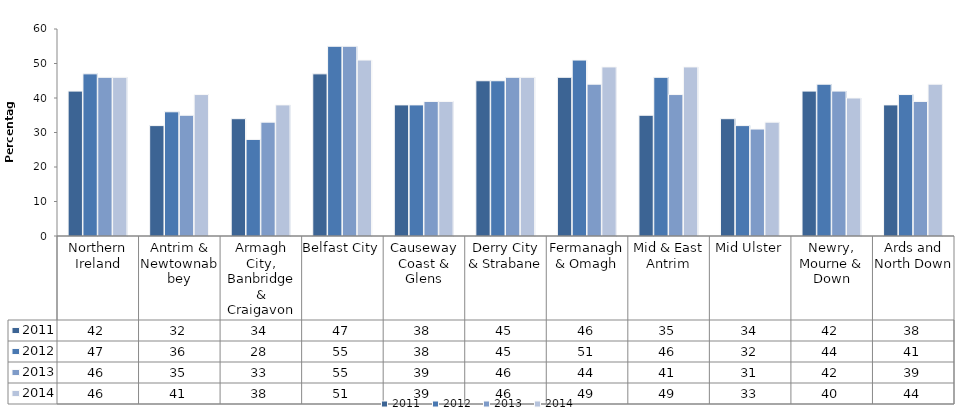
| Category | 2011 | 2012 | 2013 | 2014 |
|---|---|---|---|---|
| Northern Ireland | 42 | 47 | 46 | 46 |
| Antrim & Newtownabbey | 32 | 36 | 35 | 41 |
| Armagh City, Banbridge & Craigavon | 34 | 28 | 33 | 38 |
| Belfast City | 47 | 55 | 55 | 51 |
| Causeway Coast & Glens | 38 | 38 | 39 | 39 |
| Derry City & Strabane | 45 | 45 | 46 | 46 |
| Fermanagh & Omagh | 46 | 51 | 44 | 49 |
| Mid & East Antrim | 35 | 46 | 41 | 49 |
| Mid Ulster | 34 | 32 | 31 | 33 |
| Newry, Mourne & Down | 42 | 44 | 42 | 40 |
| Ards and North Down | 38 | 41 | 39 | 44 |